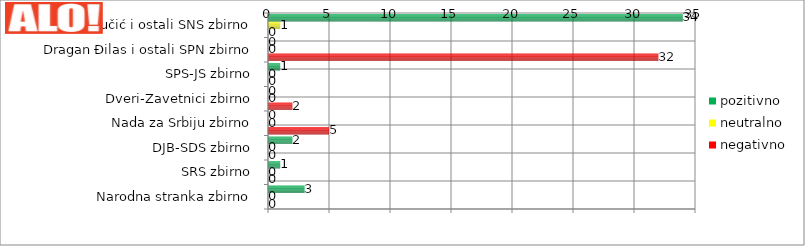
| Category | pozitivno | neutralno | negativno |
|---|---|---|---|
| Aleksandar Vučić i ostali SNS zbirno | 34 | 1 | 0 |
| Dragan Đilas i ostali SPN zbirno | 0 | 0 | 32 |
| SPS-JS zbirno | 1 | 0 | 0 |
| Dveri-Zavetnici zbirno | 0 | 0 | 2 |
| Nada za Srbiju zbirno | 0 | 0 | 5 |
| DJB-SDS zbirno | 2 | 0 | 0 |
| SRS zbirno | 1 | 0 | 0 |
| Narodna stranka zbirno | 3 | 0 | 0 |